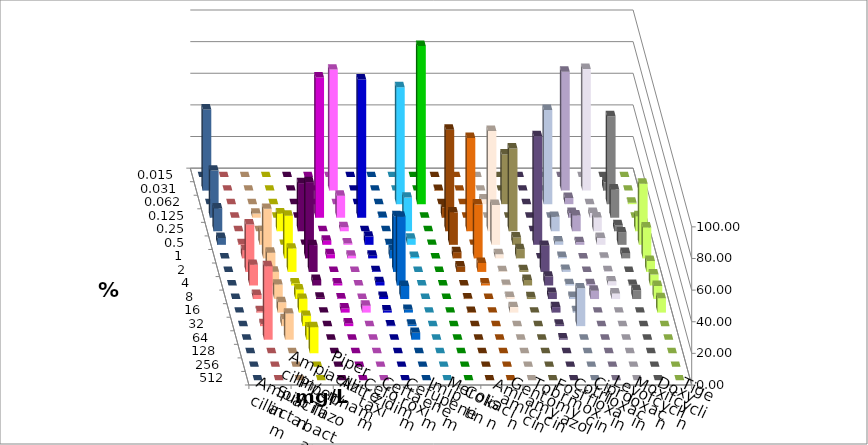
| Category | Ampicillin | Ampicillin/ Sulbactam | Piperacillin | Piperacillin/ Tazobactam | Aztreonam | Cefotaxim | Ceftazidim | Cefuroxim | Imipenem | Meropenem | Colistin | Amikacin | Gentamicin | Tobramycin | Fosfomycin | Cotrimoxazol | Ciprofloxacin | Levofloxacin | Moxifloxacin | Doxycyclin | Tigecyclin |
|---|---|---|---|---|---|---|---|---|---|---|---|---|---|---|---|---|---|---|---|---|---|
| 0.015 | 0 | 0 | 0 | 0 | 0 | 0 | 0 | 0 | 0 | 0 | 0 | 0 | 0 | 0 | 0 | 0 | 0 | 0 | 0 | 0 | 0 |
| 0.031 | 0 | 0 | 0 | 0 | 0 | 76.522 | 0 | 0 | 0 | 0 | 0.437 | 0 | 0 | 0 | 0 | 0 | 75.217 | 76.957 | 5.217 | 0 | 51.316 |
| 0.062 | 0 | 0 | 0 | 0 | 0 | 0 | 0 | 0 | 73.913 | 100 | 0 | 0 | 3.043 | 31.395 | 0 | 59.565 | 3.913 | 0 | 55.652 | 0.87 | 0 |
| 0.125 | 0 | 2.609 | 0 | 0 | 88.646 | 13.913 | 87.391 | 0.435 | 0 | 0 | 6.55 | 0 | 0 | 0 | 0 | 0 | 3.043 | 3.043 | 17.826 | 0 | 29.825 |
| 0.25 | 0 | 0 | 11.304 | 30.435 | 0 | 2.609 | 0 | 0 | 21.304 | 0 | 64.192 | 58.952 | 63.478 | 52.326 | 0 | 9.13 | 10 | 8.696 | 3.913 | 9.565 | 14.474 |
| 0.5 | 0.435 | 8.696 | 0 | 0 | 2.62 | 0.87 | 5.217 | 0.435 | 3.913 | 0 | 20.524 | 0 | 25.217 | 4.651 | 68.696 | 2.174 | 1.739 | 4.348 | 7.826 | 38.696 | 4.386 |
| 1.0 | 5.217 | 31.304 | 26.957 | 48.261 | 2.62 | 1.739 | 1.739 | 5.217 | 0.87 | 0 | 3.93 | 34.061 | 2.609 | 5.814 | 0 | 0.87 | 0 | 0.435 | 3.478 | 19.565 | 0 |
| 2.0 | 30 | 12.174 | 14.783 | 16.957 | 0 | 0 | 0.435 | 35.217 | 0 | 0 | 3.493 | 5.677 | 0.435 | 1.163 | 16.522 | 1.304 | 0 | 0.435 | 0 | 6.957 | 0 |
| 4.0 | 13.043 | 8.696 | 1.304 | 3.478 | 1.31 | 0 | 2.174 | 43.478 | 0 | 0 | 0 | 1.31 | 0.435 | 3.488 | 5.652 | 0.87 | 0.87 | 2.609 | 0.435 | 6.957 | 0 |
| 8.0 | 2.609 | 9.13 | 6.087 | 0.87 | 0.437 | 0 | 1.304 | 8.261 | 0 | 0 | 0.437 | 0 | 1.304 | 1.163 | 3.913 | 1.304 | 5.217 | 3.478 | 5.652 | 8.261 | 0 |
| 16.0 | 0.87 | 6.522 | 8.696 | 0 | 2.62 | 4.348 | 1.304 | 1.739 | 0 | 0 | 0.437 | 0 | 3.478 | 0 | 3.478 | 0.87 | 0 | 0 | 0 | 9.13 | 0 |
| 32.0 | 1.304 | 4.348 | 6.522 | 0 | 1.747 | 0 | 0.435 | 0.87 | 0 | 0 | 0 | 0 | 0 | 0 | 0.87 | 23.913 | 0 | 0 | 0 | 0 | 0 |
| 64.0 | 46.522 | 16.522 | 7.826 | 0 | 0 | 0 | 0 | 4.348 | 0 | 0 | 0 | 0 | 0 | 0 | 0.87 | 0 | 0 | 0 | 0 | 0 | 0 |
| 128.0 | 0 | 0 | 16.522 | 0 | 0 | 0 | 0 | 0 | 0 | 0 | 0 | 0 | 0 | 0 | 0 | 0 | 0 | 0 | 0 | 0 | 0 |
| 256.0 | 0 | 0 | 0 | 0 | 0 | 0 | 0 | 0 | 0 | 0 | 0 | 0 | 0 | 0 | 0 | 0 | 0 | 0 | 0 | 0 | 0 |
| 512.0 | 0 | 0 | 0 | 0 | 0 | 0 | 0 | 0 | 0 | 0 | 0 | 0 | 0 | 0 | 0 | 0 | 0 | 0 | 0 | 0 | 0 |